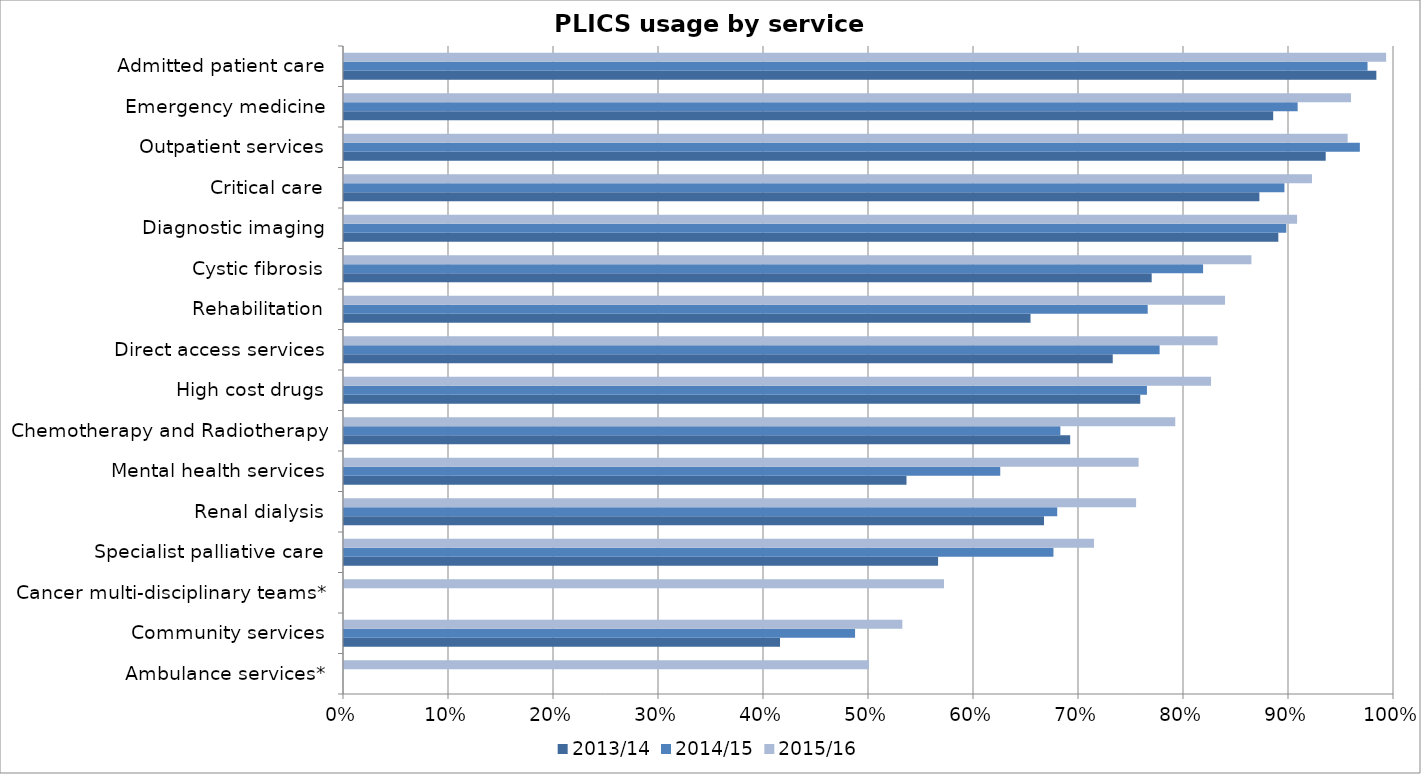
| Category | 2013/14 | 2014/15 | 2015/16 |
|---|---|---|---|
| Ambulance services* | 0 | 0 | 0.5 |
| Community services | 0.415 | 0.487 | 0.532 |
| Cancer multi-disciplinary teams* | 0 | 0 | 0.571 |
| Specialist palliative care | 0.566 | 0.676 | 0.714 |
| Renal dialysis | 0.667 | 0.679 | 0.754 |
| Mental health services | 0.536 | 0.625 | 0.757 |
| Chemotherapy and Radiotherapy | 0.692 | 0.682 | 0.792 |
| High cost drugs | 0.758 | 0.765 | 0.826 |
| Direct access services | 0.732 | 0.777 | 0.832 |
| Rehabilitation | 0.654 | 0.765 | 0.839 |
| Cystic fibrosis | 0.769 | 0.818 | 0.864 |
| Diagnostic imaging | 0.89 | 0.897 | 0.908 |
| Critical care | 0.872 | 0.896 | 0.922 |
| Outpatient services | 0.935 | 0.967 | 0.956 |
| Emergency medicine | 0.885 | 0.908 | 0.959 |
| Admitted patient care | 0.983 | 0.975 | 0.992 |